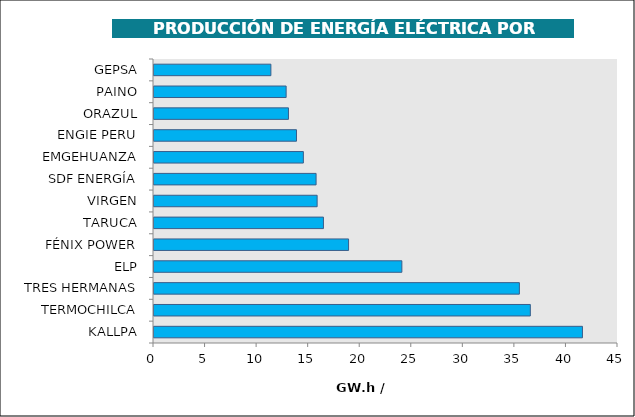
| Category | Series 0 |
|---|---|
| KALLPA | 41.552 |
| TERMOCHILCA | 36.499 |
| TRES HERMANAS | 35.436 |
| ELP | 24.039 |
| FÉNIX POWER | 18.87 |
| TARUCA | 16.433 |
| VIRGEN | 15.82 |
| SDF ENERGÍA | 15.72 |
| EMGEHUANZA | 14.486 |
| ENGIE PERU | 13.819 |
| ORAZUL | 13.04 |
| PAINO | 12.815 |
| GEPSA | 11.336 |